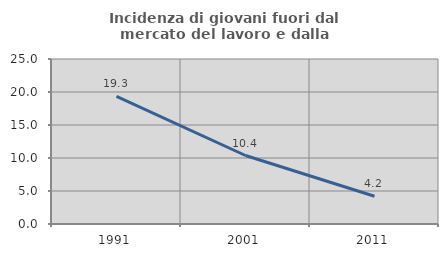
| Category | Incidenza di giovani fuori dal mercato del lavoro e dalla formazione  |
|---|---|
| 1991.0 | 19.333 |
| 2001.0 | 10.377 |
| 2011.0 | 4.211 |